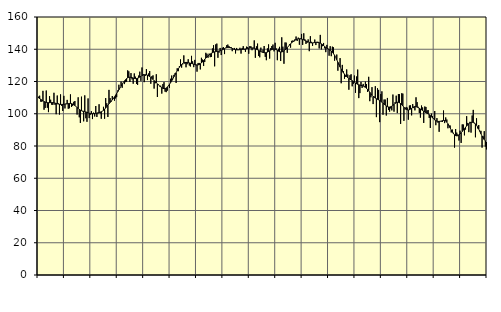
| Category | Piggar | Series 1 |
|---|---|---|
| nan | 110.6 | 109.77 |
| 87.0 | 111.2 | 109.42 |
| 87.0 | 107.5 | 108.99 |
| 87.0 | 107.4 | 108.47 |
| 87.0 | 114.2 | 108.03 |
| 87.0 | 102.5 | 107.58 |
| 87.0 | 103.6 | 107.28 |
| 87.0 | 114.4 | 107.03 |
| 87.0 | 103.7 | 106.88 |
| 87.0 | 101 | 106.85 |
| 87.0 | 110.9 | 106.86 |
| 87.0 | 108.7 | 106.91 |
| nan | 105.6 | 106.92 |
| 88.0 | 105.5 | 106.88 |
| 88.0 | 113 | 106.78 |
| 88.0 | 105.5 | 106.61 |
| 88.0 | 99.7 | 106.4 |
| 88.0 | 111.3 | 106.2 |
| 88.0 | 106.4 | 106.02 |
| 88.0 | 99.5 | 105.88 |
| 88.0 | 112 | 105.78 |
| 88.0 | 104.9 | 105.77 |
| 88.0 | 101.7 | 105.81 |
| 88.0 | 111.1 | 105.86 |
| nan | 103.3 | 105.95 |
| 89.0 | 106.3 | 106.06 |
| 89.0 | 108.6 | 106.16 |
| 89.0 | 103.1 | 106.28 |
| 89.0 | 103.4 | 106.37 |
| 89.0 | 112 | 106.38 |
| 89.0 | 104.2 | 106.26 |
| 89.0 | 104.9 | 106 |
| 89.0 | 107.4 | 105.6 |
| 89.0 | 107.9 | 105.1 |
| 89.0 | 104.5 | 104.51 |
| 89.0 | 99.5 | 103.89 |
| nan | 110.2 | 103.27 |
| 90.0 | 97.8 | 102.71 |
| 90.0 | 94.3 | 102.25 |
| 90.0 | 110.6 | 101.9 |
| 90.0 | 101.5 | 101.67 |
| 90.0 | 95.3 | 101.48 |
| 90.0 | 111.4 | 101.3 |
| 90.0 | 97.2 | 101.12 |
| 90.0 | 95 | 100.9 |
| 90.0 | 109.5 | 100.62 |
| 90.0 | 97.3 | 100.36 |
| 90.0 | 99.4 | 100.17 |
| nan | 101.6 | 100.04 |
| 91.0 | 96.7 | 100.01 |
| 91.0 | 100.7 | 100.07 |
| 91.0 | 98.3 | 100.16 |
| 91.0 | 104.8 | 100.27 |
| 91.0 | 98 | 100.43 |
| 91.0 | 100.1 | 100.59 |
| 91.0 | 105.9 | 100.75 |
| 91.0 | 100.2 | 100.97 |
| 91.0 | 96.9 | 101.25 |
| 91.0 | 101.6 | 101.6 |
| 91.0 | 104.3 | 102.11 |
| nan | 96.9 | 102.78 |
| 92.0 | 109.7 | 103.58 |
| 92.0 | 106.5 | 104.44 |
| 92.0 | 98 | 105.32 |
| 92.0 | 114.8 | 106.17 |
| 92.0 | 109.7 | 106.98 |
| 92.0 | 107.4 | 107.8 |
| 92.0 | 111 | 108.62 |
| 92.0 | 109.2 | 109.5 |
| 92.0 | 108.1 | 110.47 |
| 92.0 | 109.5 | 111.51 |
| 92.0 | 110.3 | 112.59 |
| nan | 114.5 | 113.7 |
| 93.0 | 118 | 114.84 |
| 93.0 | 116.1 | 115.98 |
| 93.0 | 119.9 | 117.16 |
| 93.0 | 116.1 | 118.32 |
| 93.0 | 119.4 | 119.38 |
| 93.0 | 118.4 | 120.31 |
| 93.0 | 119.6 | 121.13 |
| 93.0 | 119.8 | 121.79 |
| 93.0 | 126.9 | 122.27 |
| 93.0 | 126.3 | 122.58 |
| 93.0 | 119.7 | 122.68 |
| nan | 125.2 | 122.6 |
| 94.0 | 121.3 | 122.39 |
| 94.0 | 118.6 | 122.14 |
| 94.0 | 125 | 121.91 |
| 94.0 | 123 | 121.79 |
| 94.0 | 118.5 | 121.82 |
| 94.0 | 117.9 | 122.01 |
| 94.0 | 123.7 | 122.35 |
| 94.0 | 126.1 | 122.79 |
| 94.0 | 120.4 | 123.24 |
| 94.0 | 128.7 | 123.64 |
| 94.0 | 124.6 | 123.98 |
| nan | 119.6 | 124.19 |
| 95.0 | 123.5 | 124.24 |
| 95.0 | 127.7 | 124.14 |
| 95.0 | 120.9 | 123.89 |
| 95.0 | 125 | 123.51 |
| 95.0 | 126.5 | 123.06 |
| 95.0 | 118.6 | 122.56 |
| 95.0 | 123.3 | 121.98 |
| 95.0 | 123.8 | 121.31 |
| 95.0 | 115.6 | 120.6 |
| 95.0 | 118.9 | 119.89 |
| 95.0 | 124.5 | 119.19 |
| nan | 110.4 | 118.53 |
| 96.0 | 118.2 | 117.9 |
| 96.0 | 117 | 117.28 |
| 96.0 | 117.4 | 116.68 |
| 96.0 | 112.5 | 116.16 |
| 96.0 | 118.4 | 115.75 |
| 96.0 | 119.6 | 115.55 |
| 96.0 | 113.7 | 115.61 |
| 96.0 | 113.4 | 115.94 |
| 96.0 | 114.3 | 116.52 |
| 96.0 | 117.5 | 117.3 |
| 96.0 | 116 | 118.25 |
| nan | 121.7 | 119.31 |
| 97.0 | 123.7 | 120.46 |
| 97.0 | 121.4 | 121.67 |
| 97.0 | 124.1 | 122.92 |
| 97.0 | 125.1 | 124.21 |
| 97.0 | 119.1 | 125.47 |
| 97.0 | 128.2 | 126.67 |
| 97.0 | 126.4 | 127.8 |
| 97.0 | 129.6 | 128.84 |
| 97.0 | 133.7 | 129.77 |
| 97.0 | 128.6 | 130.56 |
| 97.0 | 130.6 | 131.16 |
| nan | 136.2 | 131.56 |
| 98.0 | 131 | 131.78 |
| 98.0 | 128.8 | 131.84 |
| 98.0 | 130.7 | 131.8 |
| 98.0 | 133.8 | 131.69 |
| 98.0 | 129.9 | 131.54 |
| 98.0 | 129.3 | 131.36 |
| 98.0 | 135.9 | 131.17 |
| 98.0 | 132.5 | 130.97 |
| 98.0 | 128.9 | 130.75 |
| 98.0 | 133.4 | 130.53 |
| 98.0 | 130.1 | 130.35 |
| nan | 126.1 | 130.26 |
| 99.0 | 131.5 | 130.29 |
| 99.0 | 131.5 | 130.53 |
| 99.0 | 127.5 | 130.96 |
| 99.0 | 134.7 | 131.52 |
| 99.0 | 133.6 | 132.22 |
| 99.0 | 129.6 | 133 |
| 99.0 | 132.1 | 133.79 |
| 99.0 | 137.8 | 134.53 |
| 99.0 | 137.2 | 135.24 |
| 99.0 | 134.7 | 135.9 |
| 99.0 | 137.3 | 136.49 |
| nan | 135.1 | 137.02 |
| 0.0 | 135.2 | 137.48 |
| 0.0 | 140.5 | 137.85 |
| 0.0 | 142.5 | 138.16 |
| 0.0 | 129.4 | 138.4 |
| 0.0 | 143 | 138.56 |
| 0.0 | 143.5 | 138.67 |
| 0.0 | 134.7 | 138.79 |
| 0.0 | 137.9 | 138.92 |
| 0.0 | 140.8 | 139.08 |
| 0.0 | 136.4 | 139.32 |
| 0.0 | 140.9 | 139.63 |
| nan | 141.3 | 140 |
| 1.0 | 137 | 140.4 |
| 1.0 | 140.9 | 140.76 |
| 1.0 | 142.5 | 141.01 |
| 1.0 | 142.9 | 141.15 |
| 1.0 | 142 | 141.18 |
| 1.0 | 140.8 | 141.05 |
| 1.0 | 141.3 | 140.8 |
| 1.0 | 138.8 | 140.51 |
| 1.0 | 140 | 140.21 |
| 1.0 | 140.8 | 139.94 |
| 1.0 | 137.4 | 139.74 |
| nan | 140.8 | 139.62 |
| 2.0 | 139.9 | 139.6 |
| 2.0 | 139.5 | 139.66 |
| 2.0 | 140.9 | 139.76 |
| 2.0 | 137.3 | 139.86 |
| 2.0 | 140.8 | 139.93 |
| 2.0 | 141.9 | 140.01 |
| 2.0 | 139.8 | 140.1 |
| 2.0 | 138.4 | 140.19 |
| 2.0 | 141.6 | 140.3 |
| 2.0 | 141.3 | 140.44 |
| 2.0 | 137.2 | 140.6 |
| nan | 142 | 140.74 |
| 3.0 | 141.8 | 140.81 |
| 3.0 | 139.4 | 140.78 |
| 3.0 | 141 | 140.67 |
| 3.0 | 145.5 | 140.5 |
| 3.0 | 134.7 | 140.28 |
| 3.0 | 141.8 | 139.99 |
| 3.0 | 143.5 | 139.67 |
| 3.0 | 135.8 | 139.34 |
| 3.0 | 135 | 138.99 |
| 3.0 | 141 | 138.62 |
| 3.0 | 138.2 | 138.3 |
| nan | 139.8 | 138.03 |
| 4.0 | 142 | 137.85 |
| 4.0 | 135.3 | 137.83 |
| 4.0 | 133.2 | 137.97 |
| 4.0 | 140.5 | 138.23 |
| 4.0 | 143 | 138.61 |
| 4.0 | 134.2 | 139.06 |
| 4.0 | 140.7 | 139.48 |
| 4.0 | 142 | 139.85 |
| 4.0 | 142.9 | 140.11 |
| 4.0 | 138.7 | 140.18 |
| 4.0 | 144 | 140.03 |
| nan | 140.5 | 139.71 |
| 5.0 | 133.2 | 139.27 |
| 5.0 | 140.3 | 138.83 |
| 5.0 | 141.5 | 138.5 |
| 5.0 | 132.7 | 138.33 |
| 5.0 | 147.4 | 138.35 |
| 5.0 | 141.6 | 138.58 |
| 5.0 | 131 | 139.02 |
| 5.0 | 144.2 | 139.59 |
| 5.0 | 144.1 | 140.27 |
| 5.0 | 137.8 | 141.02 |
| 5.0 | 141.9 | 141.81 |
| nan | 143 | 142.58 |
| 6.0 | 141 | 143.34 |
| 6.0 | 145.2 | 144.04 |
| 6.0 | 145.4 | 144.64 |
| 6.0 | 144.7 | 145.15 |
| 6.0 | 146.2 | 145.61 |
| 6.0 | 147.9 | 145.97 |
| 6.0 | 145.1 | 146.26 |
| 6.0 | 147.2 | 146.46 |
| 6.0 | 142.8 | 146.51 |
| 6.0 | 146.7 | 146.45 |
| 6.0 | 149.5 | 146.31 |
| nan | 142.7 | 146.09 |
| 7.0 | 149.9 | 145.81 |
| 7.0 | 146.2 | 145.5 |
| 7.0 | 143.3 | 145.16 |
| 7.0 | 144 | 144.83 |
| 7.0 | 146.1 | 144.53 |
| 7.0 | 138.8 | 144.26 |
| 7.0 | 148.1 | 144.06 |
| 7.0 | 144.6 | 143.95 |
| 7.0 | 142.1 | 143.94 |
| 7.0 | 143.9 | 144.04 |
| 7.0 | 146 | 144.15 |
| nan | 142.6 | 144.24 |
| 8.0 | 144.6 | 144.28 |
| 8.0 | 144.6 | 144.22 |
| 8.0 | 140.5 | 144.05 |
| 8.0 | 148.9 | 143.77 |
| 8.0 | 139.9 | 143.35 |
| 8.0 | 141.9 | 142.84 |
| 8.0 | 143.9 | 142.28 |
| 8.0 | 140.6 | 141.68 |
| 8.0 | 138.2 | 141.12 |
| 8.0 | 142.7 | 140.63 |
| 8.0 | 140.4 | 140.17 |
| nan | 136 | 139.75 |
| 9.0 | 141.9 | 139.32 |
| 9.0 | 135.7 | 138.8 |
| 9.0 | 141.6 | 138.15 |
| 9.0 | 141.2 | 137.32 |
| 9.0 | 132.9 | 136.23 |
| 9.0 | 134.9 | 134.93 |
| 9.0 | 136.7 | 133.49 |
| 9.0 | 126.7 | 131.98 |
| 9.0 | 130.9 | 130.45 |
| 9.0 | 134.5 | 128.99 |
| 9.0 | 118.9 | 127.65 |
| nan | 130.3 | 126.45 |
| 10.0 | 126.4 | 125.45 |
| 10.0 | 121.7 | 124.57 |
| 10.0 | 122.9 | 123.77 |
| 10.0 | 127.5 | 123.03 |
| 10.0 | 124.3 | 122.41 |
| 10.0 | 114.9 | 121.89 |
| 10.0 | 123.9 | 121.42 |
| 10.0 | 124.5 | 120.96 |
| 10.0 | 117 | 120.53 |
| 10.0 | 118.5 | 120.05 |
| 10.0 | 123.7 | 119.55 |
| nan | 113 | 119.08 |
| 11.0 | 123.1 | 118.62 |
| 11.0 | 127.4 | 118.25 |
| 11.0 | 109.7 | 117.99 |
| 11.0 | 112.8 | 117.77 |
| 11.0 | 119.7 | 117.59 |
| 11.0 | 116 | 117.42 |
| 11.0 | 118.5 | 117.19 |
| 11.0 | 116.5 | 116.87 |
| 11.0 | 119.9 | 116.42 |
| 11.0 | 118.4 | 115.8 |
| 11.0 | 113.5 | 115.08 |
| nan | 122.9 | 114.26 |
| 12.0 | 107.8 | 113.34 |
| 12.0 | 110.2 | 112.39 |
| 12.0 | 116.5 | 111.5 |
| 12.0 | 106 | 110.76 |
| 12.0 | 110.7 | 110.18 |
| 12.0 | 117.1 | 109.71 |
| 12.0 | 97.9 | 109.31 |
| 12.0 | 115.8 | 108.96 |
| 12.0 | 114.8 | 108.61 |
| 12.0 | 94.8 | 108.21 |
| 12.0 | 112.2 | 107.72 |
| nan | 113.9 | 107.16 |
| 13.0 | 99.4 | 106.56 |
| 13.0 | 108.8 | 105.94 |
| 13.0 | 108.8 | 105.35 |
| 13.0 | 98.9 | 104.83 |
| 13.0 | 109.8 | 104.41 |
| 13.0 | 102.3 | 104.2 |
| 13.0 | 101.3 | 104.18 |
| 13.0 | 103.3 | 104.36 |
| 13.0 | 102.1 | 104.7 |
| 13.0 | 111.9 | 105.21 |
| 13.0 | 101.3 | 105.82 |
| nan | 107.2 | 106.37 |
| 14.0 | 111.2 | 106.81 |
| 14.0 | 100.4 | 107.08 |
| 14.0 | 112.2 | 107.07 |
| 14.0 | 112.1 | 106.8 |
| 14.0 | 93.7 | 106.3 |
| 14.0 | 112.7 | 105.61 |
| 14.0 | 112.5 | 104.85 |
| 14.0 | 95.6 | 104.08 |
| 14.0 | 102.7 | 103.37 |
| 14.0 | 104.2 | 102.78 |
| 14.0 | 103.8 | 102.4 |
| nan | 96.3 | 102.33 |
| 15.0 | 105.1 | 102.51 |
| 15.0 | 105.2 | 102.88 |
| 15.0 | 99 | 103.38 |
| 15.0 | 106 | 103.87 |
| 15.0 | 103.5 | 104.25 |
| 15.0 | 102.1 | 104.46 |
| 15.0 | 110.2 | 104.39 |
| 15.0 | 107.2 | 104.12 |
| 15.0 | 104.3 | 103.79 |
| 15.0 | 100.5 | 103.39 |
| 15.0 | 97.6 | 102.94 |
| nan | 105.1 | 102.49 |
| 16.0 | 103.9 | 102.02 |
| 16.0 | 94.3 | 101.56 |
| 16.0 | 104.5 | 101.11 |
| 16.0 | 104.2 | 100.69 |
| 16.0 | 102 | 100.3 |
| 16.0 | 102.3 | 99.9 |
| 16.0 | 97.4 | 99.43 |
| 16.0 | 91.2 | 98.85 |
| 16.0 | 100.1 | 98.17 |
| 16.0 | 98.6 | 97.46 |
| 16.0 | 96.9 | 96.77 |
| nan | 101.7 | 96.16 |
| 17.0 | 92.9 | 95.67 |
| 17.0 | 97.3 | 95.37 |
| 17.0 | 94.4 | 95.25 |
| 17.0 | 88.8 | 95.25 |
| 17.0 | 95.3 | 95.35 |
| 17.0 | 95.2 | 95.5 |
| 17.0 | 94.9 | 95.7 |
| 17.0 | 102 | 95.84 |
| 17.0 | 94.2 | 95.8 |
| 17.0 | 97.7 | 95.45 |
| 17.0 | 96.4 | 94.78 |
| nan | 91 | 93.78 |
| 18.0 | 92.8 | 92.57 |
| 18.0 | 92.7 | 91.24 |
| 18.0 | 88.4 | 89.88 |
| 18.0 | 90.2 | 88.66 |
| 18.0 | 88.2 | 87.68 |
| 18.0 | 79 | 86.94 |
| 18.0 | 90.5 | 86.47 |
| 18.0 | 88.3 | 86.29 |
| 18.0 | 87.2 | 86.4 |
| 18.0 | 83.4 | 86.82 |
| 18.0 | 89.5 | 87.45 |
| nan | 81.9 | 88.19 |
| 19.0 | 93.4 | 88.99 |
| 19.0 | 93.3 | 89.86 |
| 19.0 | 86.6 | 90.74 |
| 19.0 | 90.2 | 91.61 |
| 19.0 | 98.5 | 92.42 |
| 19.0 | 94.3 | 93.15 |
| 19.0 | 88.6 | 93.78 |
| 19.0 | 95 | 94.26 |
| 19.0 | 88.3 | 94.59 |
| 19.0 | 98.9 | 94.71 |
| 19.0 | 102.4 | 94.63 |
| nan | 94 | 94.32 |
| 20.0 | 85.4 | 93.75 |
| 20.0 | 97.2 | 92.87 |
| 20.0 | 90.9 | 91.76 |
| 20.0 | 93 | 90.46 |
| 20.0 | 89.4 | 89.03 |
| 20.0 | 89.4 | 87.56 |
| 20.0 | 79 | 86.19 |
| 20.0 | 86 | 84.98 |
| 20.0 | 89.2 | 83.95 |
| 20.0 | 79.6 | 83.12 |
| 20.0 | 77.9 | 82.47 |